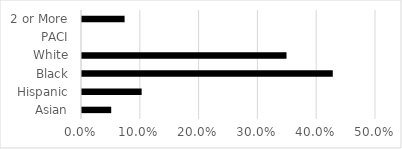
| Category | Series 0 |
|---|---|
| Asian | 0.05 |
| Hispanic | 0.101 |
| Black | 0.427 |
| White | 0.348 |
| PACI | 0 |
| 2 or More | 0.072 |